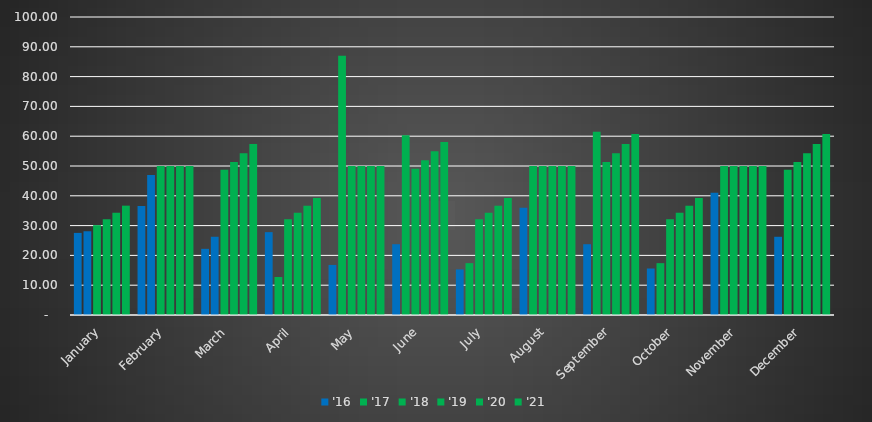
| Category | '15 | '16 | '17 | '18 | '19 | '20 | '21 |
|---|---|---|---|---|---|---|---|
| January |  | 27.55 | 28.1 | 30.15 | 32.145 | 34.319 | 36.69 |
| February |  | 36.6 | 47 | 50 | 50 | 50 | 50 |
| March |  | 22.2 | 26.25 | 48.75 | 51.329 | 54.289 | 57.422 |
| April |  | 27.8 | 12.75 | 32.145 | 34.319 | 36.69 | 39.276 |
| May |  | 16.8 | 87 | 50 | 50 | 50 | 50 |
| June |  | 23.75 | 60.3 | 49.097 | 51.923 | 54.914 | 58.077 |
| July |  | 15.3 | 17.4 | 32.145 | 34.319 | 36.69 | 39.276 |
| August |  | 36 | 50 | 50 | 50 | 50 | 50 |
| September |  | 23.75 | 61.5 | 51.329 | 54.289 | 57.422 | 60.736 |
| October |  | 15.6 | 17.4 | 32.145 | 34.319 | 36.69 | 39.276 |
| November |  | 41 | 50 | 50 | 50 | 50 | 50 |
| December |  | 26.25 | 48.75 | 51.329 | 54.289 | 57.422 | 60.736 |